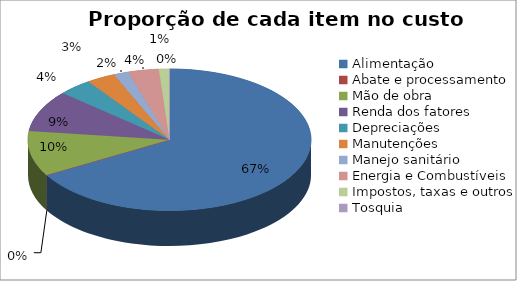
| Category | Series 0 | Series 1 |
|---|---|---|
| Alimentação | 0.667 | 0.667 |
| Abate e processamento | 0 | 0 |
| Mão de obra | 0.103 | 0.103 |
| Renda dos fatores | 0.095 | 0.095 |
| Depreciações | 0.039 | 0.039 |
| Manutenções | 0.033 | 0.033 |
| Manejo sanitário | 0.017 | 0.017 |
| Energia e Combustíveis | 0.035 | 0.035 |
| Impostos, taxas e outros | 0.012 | 0.012 |
| Tosquia | 0 | 0 |